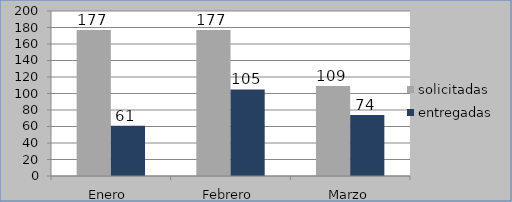
| Category | solicitadas | entregadas |
|---|---|---|
| Enero  | 177 | 61 |
| Febrero | 177 | 105 |
| Marzo | 109 | 74 |